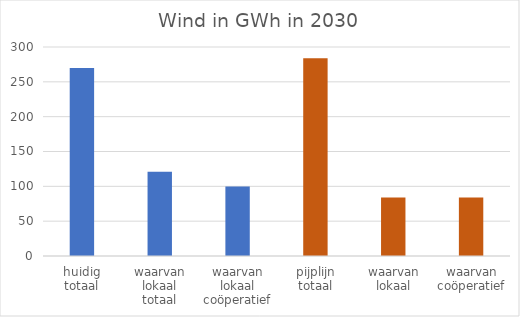
| Category | Wind in GWh |
|---|---|
| huidig totaal | 270 |
| waarvan lokaal totaal | 120.8 |
| waarvan lokaal coöperatief | 99.8 |
| pijplijn totaal | 284 |
| waarvan lokaal | 84 |
| waarvan coöperatief | 84 |